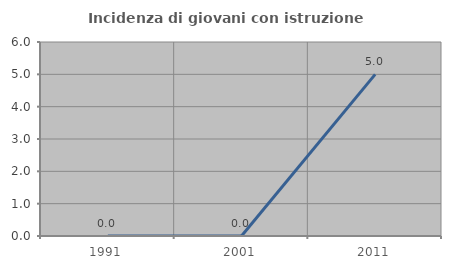
| Category | Incidenza di giovani con istruzione universitaria |
|---|---|
| 1991.0 | 0 |
| 2001.0 | 0 |
| 2011.0 | 5 |